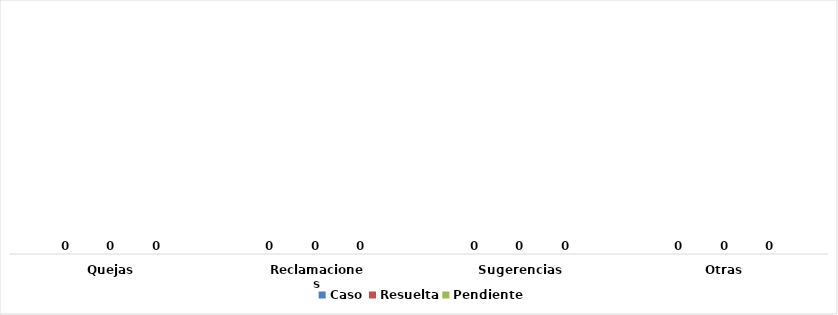
| Category | Caso | Resuelta | Pendiente |
|---|---|---|---|
| Quejas | 0 | 0 | 0 |
| Reclamaciones | 0 | 0 | 0 |
| Sugerencias | 0 | 0 | 0 |
| Otras | 0 | 0 | 0 |